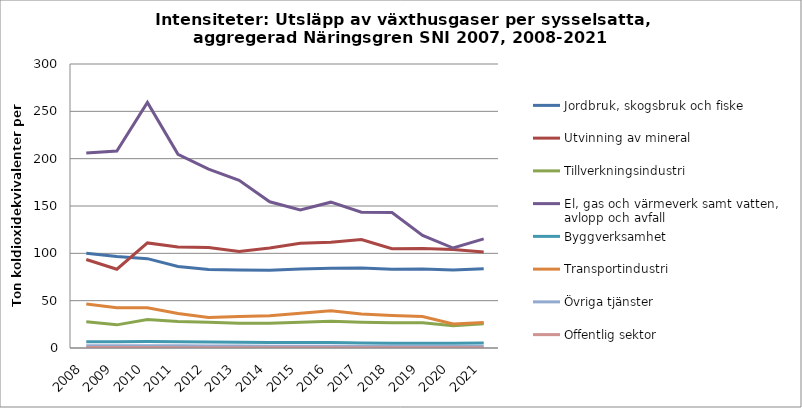
| Category | Jordbruk, skogsbruk och fiske | Utvinning av mineral | Tillverkningsindustri | El, gas och värmeverk samt vatten, avlopp och avfall | Byggverksamhet | Transportindustri | Övriga tjänster | Offentlig sektor |
|---|---|---|---|---|---|---|---|---|
| 2008 | 100.044 | 93.541 | 27.841 | 205.91 | 6.717 | 46.428 | 2.469 | 0.44 |
| 2009 | 96.721 | 83.244 | 24.446 | 208.088 | 6.607 | 42.606 | 2.348 | 0.425 |
| 2010 | 94.364 | 111.029 | 30.097 | 259.41 | 6.841 | 42.509 | 2.412 | 0.441 |
| 2011 | 86.048 | 106.617 | 27.987 | 204.532 | 6.578 | 36.527 | 2.339 | 0.391 |
| 2012 | 82.943 | 106.066 | 27.181 | 188.963 | 6.294 | 32.252 | 2.117 | 0.396 |
| 2013 | 82.378 | 101.946 | 26.07 | 177.05 | 6.169 | 33.243 | 2.05 | 0.342 |
| 2014 | 82.186 | 105.586 | 26.163 | 154.412 | 5.836 | 33.943 | 1.889 | 0.317 |
| 2015 | 83.368 | 110.652 | 27.228 | 145.892 | 5.857 | 36.682 | 1.847 | 0.306 |
| 2016 | 84.216 | 111.667 | 28.213 | 154.038 | 5.792 | 39.284 | 1.745 | 0.291 |
| 2017 | 84.634 | 114.63 | 27.231 | 143.484 | 5.155 | 35.937 | 1.674 | 0.274 |
| 2018 | 83.282 | 104.968 | 26.573 | 143.17 | 4.912 | 34.394 | 1.622 | 0.265 |
| 2019 | 83.528 | 105.217 | 26.732 | 118.873 | 5.104 | 33.282 | 1.616 | 0.282 |
| 2020 | 82.344 | 103.984 | 23.575 | 105.602 | 5.12 | 25.383 | 1.524 | 0.273 |
| 2021 | 83.752 | 101.38 | 25.635 | 115.245 | 5.192 | 27.049 | 1.468 | 0.267 |